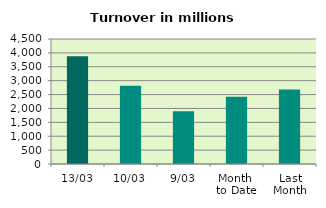
| Category | Series 0 |
|---|---|
| 13/03 | 3876.841 |
| 10/03 | 2813.746 |
| 9/03 | 1896.792 |
| Month 
to Date | 2421.145 |
| Last
Month | 2679.99 |